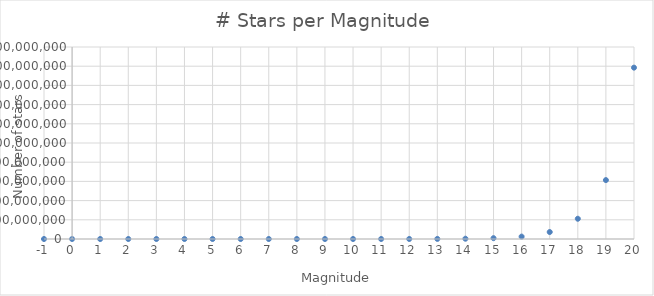
| Category | Series 0 |
|---|---|
| -1.0 | 0 |
| 0.0 | 0 |
| 1.0 | 0 |
| 2.0 | 0 |
| 3.0 | 0 |
| 4.0 | 0 |
| 5.0 | 1929 |
| 6.0 | 5946 |
| 7.0 | 17765 |
| 8.0 | 51094 |
| 9.0 | 140062 |
| 10.0 | 409194 |
| 11.0 | 1196690 |
| 12.0 | 3481113 |
| 13.0 | 10126390 |
| 14.0 | 29457184 |
| 15.0 | 85689537 |
| 16.0 | 249266759 |
| 17.0 | 725105060 |
| 18.0 | 2109295881 |
| 19.0 | 6135840666 |
| 20.0 | 17848866544 |